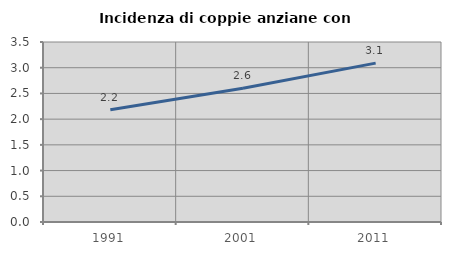
| Category | Incidenza di coppie anziane con figli |
|---|---|
| 1991.0 | 2.182 |
| 2001.0 | 2.6 |
| 2011.0 | 3.089 |